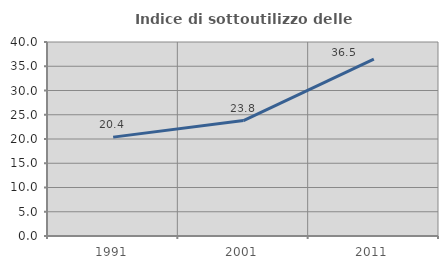
| Category | Indice di sottoutilizzo delle abitazioni  |
|---|---|
| 1991.0 | 20.386 |
| 2001.0 | 23.798 |
| 2011.0 | 36.458 |